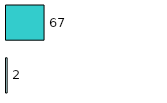
| Category | Series 0 | Series 1 |
|---|---|---|
| 0 | 2 | 67 |